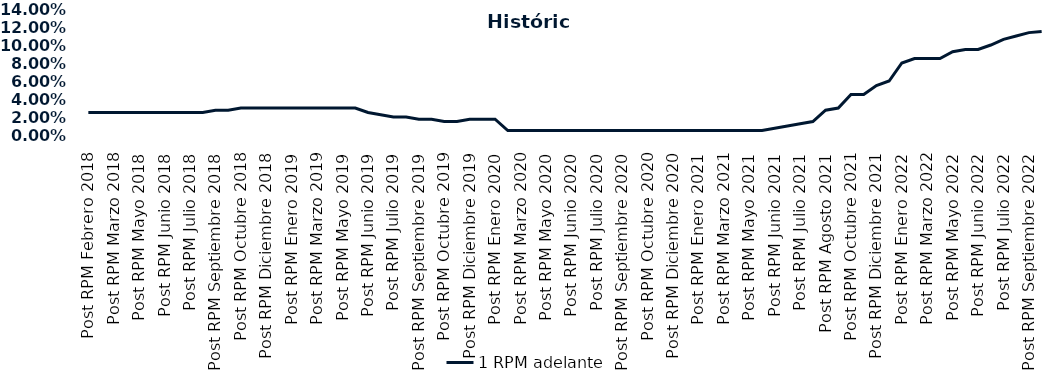
| Category | 1 RPM adelante |
|---|---|
| Post RPM Febrero 2018 | 0.025 |
| Pre RPM Marzo 2018 | 0.025 |
| Post RPM Marzo 2018 | 0.025 |
| Pre RPM Mayo 2018 | 0.025 |
| Post RPM Mayo 2018 | 0.025 |
| Pre RPM Junio 2018 | 0.025 |
| Post RPM Junio 2018 | 0.025 |
| Pre RPM Julio 2018 | 0.025 |
| Post RPM Julio 2018 | 0.025 |
| Pre RPM Septiembre 2018 | 0.025 |
| Post RPM Septiembre 2018 | 0.028 |
| Pre RPM Octubre 2018 | 0.028 |
| Post RPM Octubre 2018 | 0.03 |
| Pre RPM Diciembre 2018 | 0.03 |
| Post RPM Diciembre 2018 | 0.03 |
| Pre RPM Enero 2019 | 0.03 |
| Post RPM Enero 2019 | 0.03 |
| Pre RPM Marzo 2019 | 0.03 |
| Post RPM Marzo 2019 | 0.03 |
| Pre RPM Mayo 2019 | 0.03 |
| Post RPM Mayo 2019 | 0.03 |
| Pre RPM Junio 2019 | 0.03 |
| Post RPM Junio 2019 | 0.025 |
| Pre RPM Julio 2019 | 0.022 |
| Post RPM Julio 2019 | 0.02 |
| Pre RPM Septiembre 2019 | 0.02 |
| Post RPM Septiembre 2019 | 0.018 |
| Pre RPM Octubre 2019 | 0.018 |
| Post RPM Octubre 2019 | 0.015 |
| Pre RPM Diciembre 2019 | 0.015 |
| Post RPM Diciembre 2019 | 0.018 |
| Pre RPM Enero 2020 | 0.018 |
| Post RPM Enero 2020 | 0.018 |
| Pre RPM Marzo 2020 | 0.005 |
| Post RPM Marzo 2020 | 0.005 |
| Pre RPM Mayo 2020 | 0.005 |
| Post RPM Mayo 2020 | 0.005 |
| Pre RPM Junio 2020 | 0.005 |
| Post RPM Junio 2020 | 0.005 |
| Pre RPM Julio 2020 | 0.005 |
| Post RPM Julio 2020 | 0.005 |
| Pre RPM Septiembre 2020 | 0.005 |
| Post RPM Septiembre 2020 | 0.005 |
| Pre RPM Octubre 2020 | 0.005 |
| Post RPM Octubre 2020 | 0.005 |
| Pre RPM Diciembre 2020 | 0.005 |
| Post RPM Diciembre 2020 | 0.005 |
| Pre RPM Enero 2021 | 0.005 |
| Post RPM Enero 2021 | 0.005 |
| Pre RPM Marzo 2021 | 0.005 |
| Post RPM Marzo 2021 | 0.005 |
| Pre RPM Mayo 2021 | 0.005 |
| Post RPM Mayo 2021 | 0.005 |
| Pre RPM Junio 2021 | 0.005 |
| Post RPM Junio 2021 | 0.008 |
| Pre RPM Julio 2021 | 0.01 |
| Post RPM Julio 2021 | 0.012 |
| Pre RPM Agosto 2021 | 0.015 |
| Post RPM Agosto 2021 | 0.028 |
| Pre RPM Octubre 2021 | 0.03 |
| Post RPM Octubre 2021 | 0.045 |
| Pre RPM Diciembre 2021 | 0.045 |
| Post RPM Diciembre 2021 | 0.055 |
| Pre RPM Enero 2022 | 0.06 |
| Post RPM Enero 2022 | 0.08 |
| Pre RPM Marzo 2022 | 0.085 |
| Post RPM Marzo 2022 | 0.085 |
| Pre RPM Mayo 2022 | 0.085 |
| Post RPM Mayo 2022 | 0.092 |
| Pre RPM Junio 2022 | 0.095 |
| Post RPM Junio 2022 | 0.095 |
| Pre RPM Julio 2022 | 0.1 |
| Post RPM Julio 2022 | 0.106 |
| Pre RPM Septiembre 2022 | 0.11 |
| Post RPM Septiembre 2022 | 0.114 |
| Pre RPM Octubre 2022 | 0.115 |